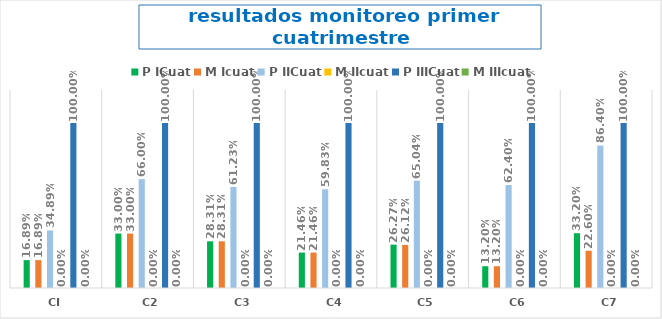
| Category | P ICuat | M Icuat | P IICuat | M IIcuat | P IIICuat | M IIIcuat |
|---|---|---|---|---|---|---|
| CI | 0.169 | 0.169 | 0.349 | 0 | 1 | 0 |
| C2 | 0.33 | 0.33 | 0.66 | 0 | 1 | 0 |
| C3 | 0.283 | 0.283 | 0.612 | 0 | 1 | 0 |
| C4 | 0.215 | 0.215 | 0.598 | 0 | 1 | 0 |
| C5 | 0.263 | 0.261 | 0.65 | 0 | 1 | 0 |
| C6 | 0.132 | 0.132 | 0.624 | 0 | 1 | 0 |
| C7 | 0.332 | 0.226 | 0.864 | 0 | 1 | 0 |